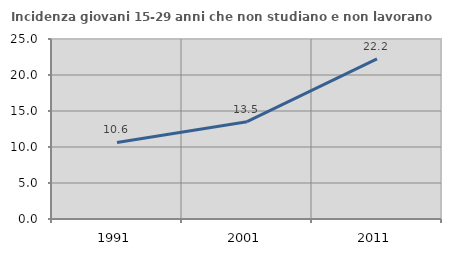
| Category | Incidenza giovani 15-29 anni che non studiano e non lavorano  |
|---|---|
| 1991.0 | 10.627 |
| 2001.0 | 13.52 |
| 2011.0 | 22.239 |